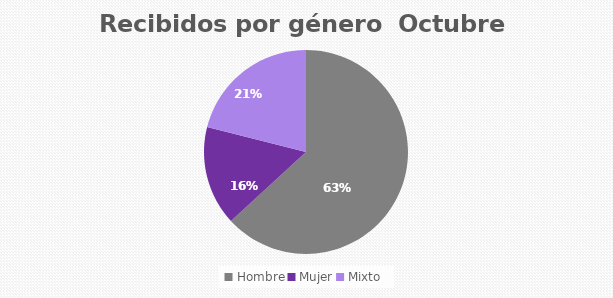
| Category | Recibidos por género  OCTUBRE |
|---|---|
| Hombre | 12 |
| Mujer | 3 |
| Mixto | 4 |